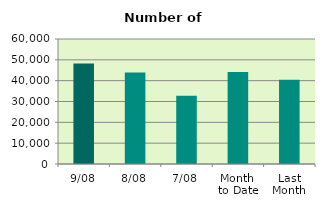
| Category | Series 0 |
|---|---|
| 9/08 | 48260 |
| 8/08 | 43882 |
| 7/08 | 32758 |
| Month 
to Date | 44134.286 |
| Last
Month | 40410.857 |